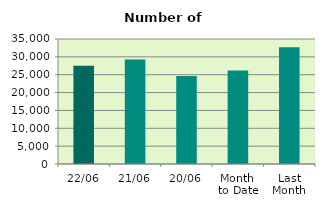
| Category | Series 0 |
|---|---|
| 22/06 | 27484 |
| 21/06 | 29294 |
| 20/06 | 24610 |
| Month 
to Date | 26199.375 |
| Last
Month | 32723.818 |